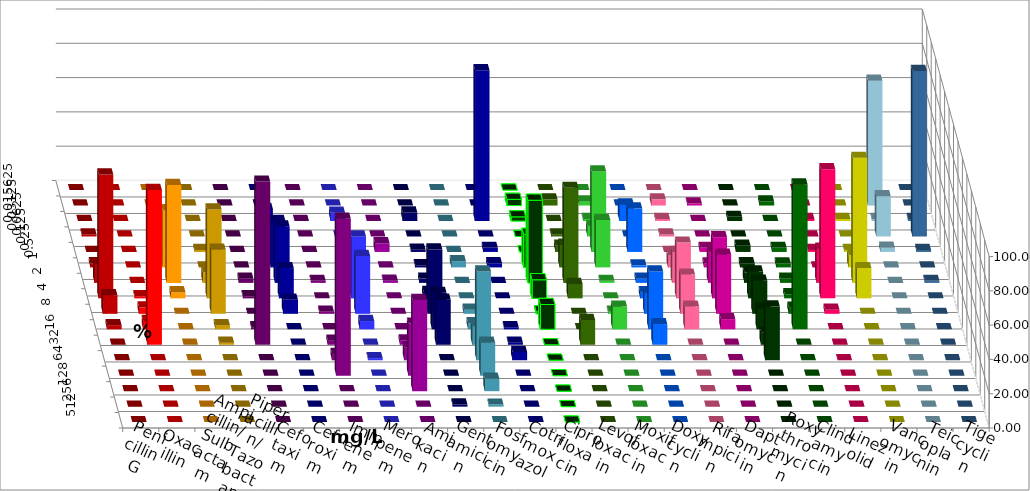
| Category | Penicillin G | Oxacillin | Ampicillin/ Sulbactam | Piperacillin/ Tazobactam | Cefotaxim | Cefuroxim | Imipenem | Meropenem | Amikacin | Gentamicin | Fosfomycin | Cotrimoxazol | Ciprofloxacin | Levofloxacin | Moxifloxacin | Doxycyclin | Rifampicin | Daptomycin | Roxythromycin | Clindamycin | Linezolid | Vancomycin | Teicoplanin | Tigecyclin |
|---|---|---|---|---|---|---|---|---|---|---|---|---|---|---|---|---|---|---|---|---|---|---|---|---|
| 0.015625 | 0 | 0 | 0 | 0 | 0 | 0 | 0 | 0 | 0 | 0 | 0 | 0 | 0 | 0 | 0 | 0 | 0 | 0 | 0 | 0 | 0 | 0 | 0 | 0 |
| 0.03125 | 0 | 0 | 0 | 0 | 0 | 0 | 0 | 0 | 0 | 0 | 0 | 0 | 3.614 | 3.614 | 2.41 | 0 | 3.614 | 1.19 | 0 | 2.381 | 0 | 0 | 0 | 72.84 |
| 0.0625 | 0 | 0 | 1.19 | 0 | 0 | 0 | 7.059 | 4.819 | 0 | 5 | 0 | 87.952 | 2.41 | 0 | 1.205 | 9.639 | 1.205 | 0 | 2.41 | 0 | 1.176 | 1.176 | 1.176 | 1.235 |
| 0.125 | 1.205 | 0 | 4.762 | 0 | 0 | 0 | 0 | 0 | 0 | 0 | 0 | 0 | 0 | 1.205 | 6.024 | 0 | 1.205 | 0 | 0 | 0 | 0 | 0 | 96.471 | 23.457 |
| 0.25 | 0 | 0 | 0 | 1.205 | 0 | 0 | 7.059 | 3.614 | 5.063 | 1.25 | 0 | 2.41 | 0 | 3.614 | 46.988 | 25.301 | 0 | 2.381 | 3.614 | 2.381 | 1.176 | 1.176 | 1.176 | 2.469 |
| 0.5 | 2.41 | 0 | 33.333 | 0 | 0 | 0 | 27.059 | 6.024 | 0 | 1.25 | 3.614 | 2.41 | 19.277 | 13.253 | 27.711 | 1.205 | 7.229 | 2.381 | 2.41 | 2.381 | 0 | 7.059 | 0 | 0 |
| 1.0 | 10.843 | 0 | 57.143 | 6.024 | 2.41 | 1.205 | 32.941 | 9.639 | 1.266 | 2.5 | 0 | 0 | 48.193 | 55.422 | 1.205 | 2.41 | 18.072 | 17.857 | 6.024 | 2.381 | 20 | 72.941 | 1.176 | 0 |
| 2.0 | 72.289 | 1.22 | 3.571 | 51.807 | 1.205 | 0 | 17.647 | 36.145 | 0 | 3.75 | 0 | 0 | 10.843 | 8.434 | 0 | 3.614 | 32.53 | 35.714 | 15.663 | 2.381 | 75.294 | 17.647 | 0 | 0 |
| 4.0 | 10.843 | 3.659 | 0 | 37.349 | 0 | 1.205 | 8.235 | 33.735 | 0 | 37.5 | 2.41 | 0 | 1.205 | 0 | 1.205 | 12.048 | 22.892 | 34.524 | 19.277 | 3.571 | 2.353 | 0 | 0 | 0 |
| 8.0 | 2.41 | 4.878 | 0 | 2.41 | 1.205 | 0 | 0 | 4.819 | 0 | 21.25 | 3.614 | 1.205 | 14.458 | 0 | 13.253 | 33.735 | 13.253 | 5.952 | 12.048 | 84.524 | 0 | 0 | 0 | 0 |
| 16.0 | 0 | 90.244 | 0 | 1.205 | 95.181 | 2.41 | 0 | 0 | 2.532 | 26.25 | 10.843 | 1.205 | 0 | 14.458 | 0 | 12.048 | 0 | 0 | 7.229 | 0 | 0 | 0 | 0 | 0 |
| 32.0 | 0 | 0 | 0 | 0 | 0 | 3.614 | 0 | 1.205 | 7.595 | 0 | 51.807 | 4.819 | 0 | 0 | 0 | 0 | 0 | 0 | 31.325 | 0 | 0 | 0 | 0 | 0 |
| 64.0 | 0 | 0 | 0 | 0 | 0 | 91.566 | 0 | 0 | 30.38 | 0 | 19.277 | 0 | 0 | 0 | 0 | 0 | 0 | 0 | 0 | 0 | 0 | 0 | 0 | 0 |
| 128.0 | 0 | 0 | 0 | 0 | 0 | 0 | 0 | 0 | 53.165 | 0 | 7.229 | 0 | 0 | 0 | 0 | 0 | 0 | 0 | 0 | 0 | 0 | 0 | 0 | 0 |
| 256.0 | 0 | 0 | 0 | 0 | 0 | 0 | 0 | 0 | 0 | 1.25 | 1.205 | 0 | 0 | 0 | 0 | 0 | 0 | 0 | 0 | 0 | 0 | 0 | 0 | 0 |
| 512.0 | 0 | 0 | 0 | 0 | 0 | 0 | 0 | 0 | 0 | 0 | 0 | 0 | 0 | 0 | 0 | 0 | 0 | 0 | 0 | 0 | 0 | 0 | 0 | 0 |